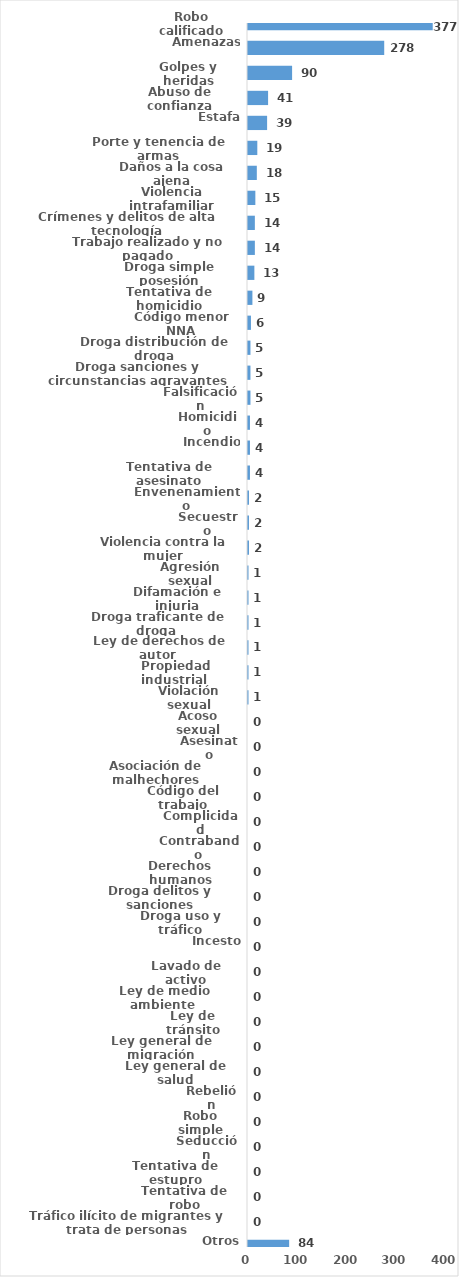
| Category | Series 0 |
|---|---|
| Robo calificado | 377 |
| Amenazas | 278 |
| Golpes y heridas | 90 |
| Abuso de confianza | 41 |
| Estafa | 39 |
| Porte y tenencia de armas | 19 |
| Daños a la cosa ajena | 18 |
| Violencia intrafamiliar | 15 |
| Crímenes y delitos de alta tecnología | 14 |
| Trabajo realizado y no pagado | 14 |
| Droga simple posesión | 13 |
| Tentativa de homicidio | 9 |
| Código menor NNA | 6 |
| Droga distribución de droga | 5 |
| Droga sanciones y circunstancias agravantes | 5 |
| Falsificación | 5 |
| Homicidio | 4 |
| Incendio | 4 |
| Tentativa de asesinato | 4 |
| Envenenamiento | 2 |
| Secuestro | 2 |
| Violencia contra la mujer | 2 |
| Agresión sexual | 1 |
| Difamación e injuria | 1 |
| Droga traficante de droga  | 1 |
| Ley de derechos de autor  | 1 |
| Propiedad industrial  | 1 |
| Violación sexual | 1 |
| Acoso sexual | 0 |
| Asesinato | 0 |
| Asociación de malhechores | 0 |
| Código del trabajo | 0 |
| Complicidad | 0 |
| Contrabando | 0 |
| Derechos humanos | 0 |
| Droga delitos y sanciones | 0 |
| Droga uso y tráfico | 0 |
| Incesto | 0 |
| Lavado de activo | 0 |
| Ley de medio ambiente  | 0 |
| Ley de tránsito | 0 |
| Ley general de migración | 0 |
| Ley general de salud | 0 |
| Rebelión | 0 |
| Robo simple | 0 |
| Seducción | 0 |
| Tentativa de estupro | 0 |
| Tentativa de robo | 0 |
| Tráfico ilícito de migrantes y trata de personas | 0 |
| Otros | 84 |